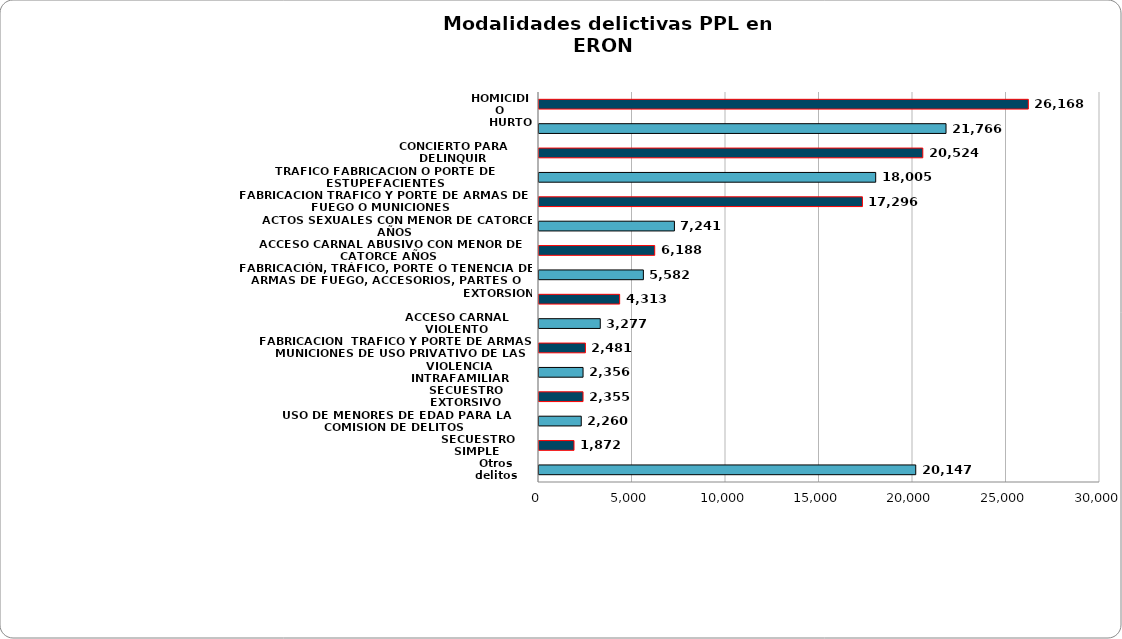
| Category | HOMICIDIO HURTO CONCIERTO PARA DELINQUIR TRAFICO FABRICACION O PORTE DE ESTUPEFACIENTES FABRICACION TRAFICO Y PORTE DE ARMAS DE FUEGO O MUNICIONES ACTOS SEXUALES CON MENOR DE CATORCE AÑOS ACCESO CARNAL ABUSIVO CON MENOR DE CATORCE AÑOS FABRICACIÓN, TRÁFIC |
|---|---|
| HOMICIDIO | 26168 |
| HURTO | 21766 |
| CONCIERTO PARA DELINQUIR | 20524 |
| TRAFICO FABRICACION O PORTE DE ESTUPEFACIENTES | 18005 |
| FABRICACION TRAFICO Y PORTE DE ARMAS DE FUEGO O MUNICIONES | 17296 |
| ACTOS SEXUALES CON MENOR DE CATORCE AÑOS | 7241 |
| ACCESO CARNAL ABUSIVO CON MENOR DE CATORCE AÑOS | 6188 |
| FABRICACIÓN, TRÁFICO, PORTE O TENENCIA DE ARMAS DE FUEGO, ACCESORIOS, PARTES O MUNICIONES | 5582 |
| EXTORSION | 4313 |
| ACCESO CARNAL VIOLENTO | 3277 |
| FABRICACION  TRAFICO Y PORTE DE ARMAS Y MUNICIONES DE USO PRIVATIVO DE LAS FUERZAS ARMADAS | 2481 |
| VIOLENCIA INTRAFAMILIAR | 2356 |
| SECUESTRO EXTORSIVO | 2355 |
| USO DE MENORES DE EDAD PARA LA COMISION DE DELITOS | 2260 |
| SECUESTRO SIMPLE | 1872 |
| Otros delitos | 20147 |